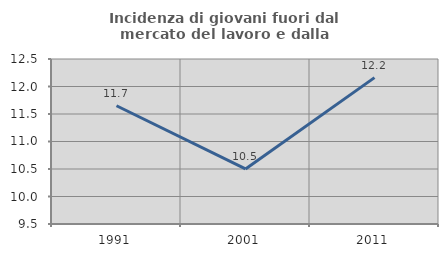
| Category | Incidenza di giovani fuori dal mercato del lavoro e dalla formazione  |
|---|---|
| 1991.0 | 11.65 |
| 2001.0 | 10.501 |
| 2011.0 | 12.161 |